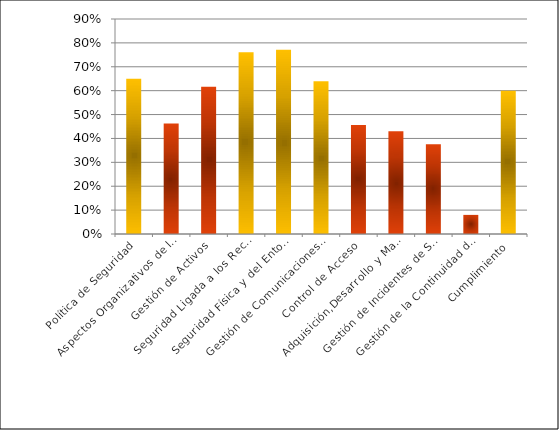
| Category | % implementación |
|---|---|
| Política de Seguridad | 0.65 |
| Aspectos Organizativos de la Seguridad de la Información | 0.462 |
| Gestión de Activos | 0.617 |
| Seguridad Ligada a los Recursos Humanos | 0.761 |
| Seguridad Física y del Entorno | 0.771 |
| Gestión de Comunicaciones y Operaciones | 0.639 |
| Control de Acceso | 0.457 |
| Adquisición,Desarrollo y Mantenimiento de Sistemas de Información | 0.431 |
| Gestión de Incidentes de Seguridad de la Información | 0.376 |
| Gestión de la Continuidad del Negocio | 0.08 |
| Cumplimiento | 0.6 |